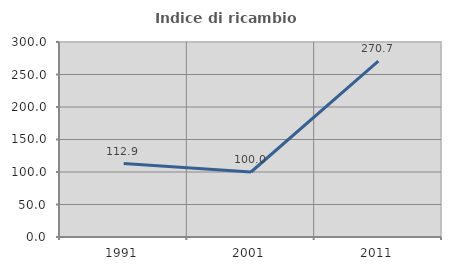
| Category | Indice di ricambio occupazionale  |
|---|---|
| 1991.0 | 112.941 |
| 2001.0 | 100 |
| 2011.0 | 270.732 |